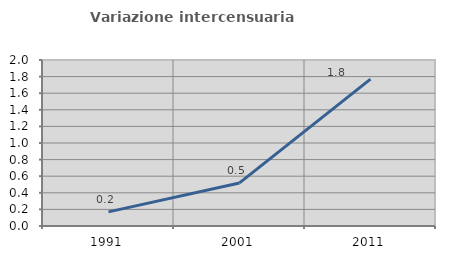
| Category | Variazione intercensuaria annua |
|---|---|
| 1991.0 | 0.17 |
| 2001.0 | 0.519 |
| 2011.0 | 1.77 |